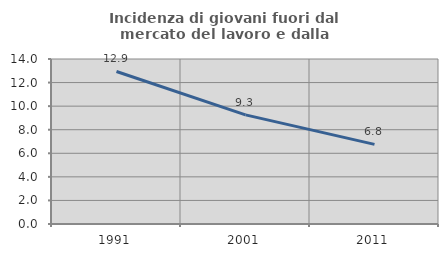
| Category | Incidenza di giovani fuori dal mercato del lavoro e dalla formazione  |
|---|---|
| 1991.0 | 12.941 |
| 2001.0 | 9.259 |
| 2011.0 | 6.757 |